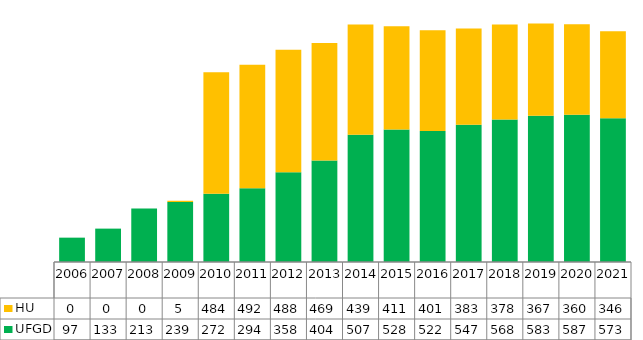
| Category | UFGD | HU |
|---|---|---|
| 2006.0 | 97 | 0 |
| 2007.0 | 133 | 0 |
| 2008.0 | 213 | 0 |
| 2009.0 | 239 | 5 |
| 2010.0 | 272 | 484 |
| 2011.0 | 294 | 492 |
| 2012.0 | 358 | 488 |
| 2013.0 | 404 | 469 |
| 2014.0 | 507 | 439 |
| 2015.0 | 528 | 411 |
| 2016.0 | 522 | 401 |
| 2017.0 | 547 | 383 |
| 2018.0 | 568 | 378 |
| 2019.0 | 583 | 367 |
| 2020.0 | 587 | 360 |
| 2021.0 | 573 | 346 |